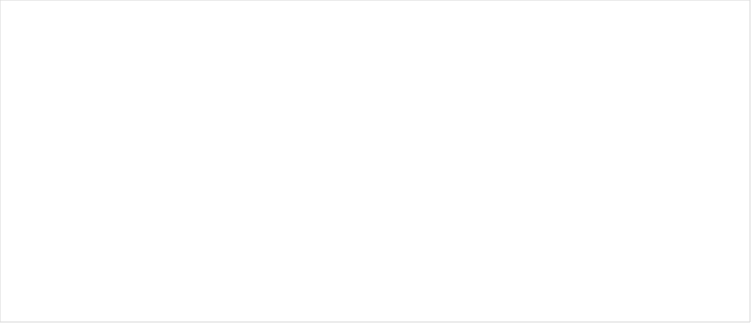
| Category | Totaal |
|---|---|
| azure | 7 |
| sql | 9 |
| ssis | 8 |
| oracle bi | 7 |
| power bi | 9 |